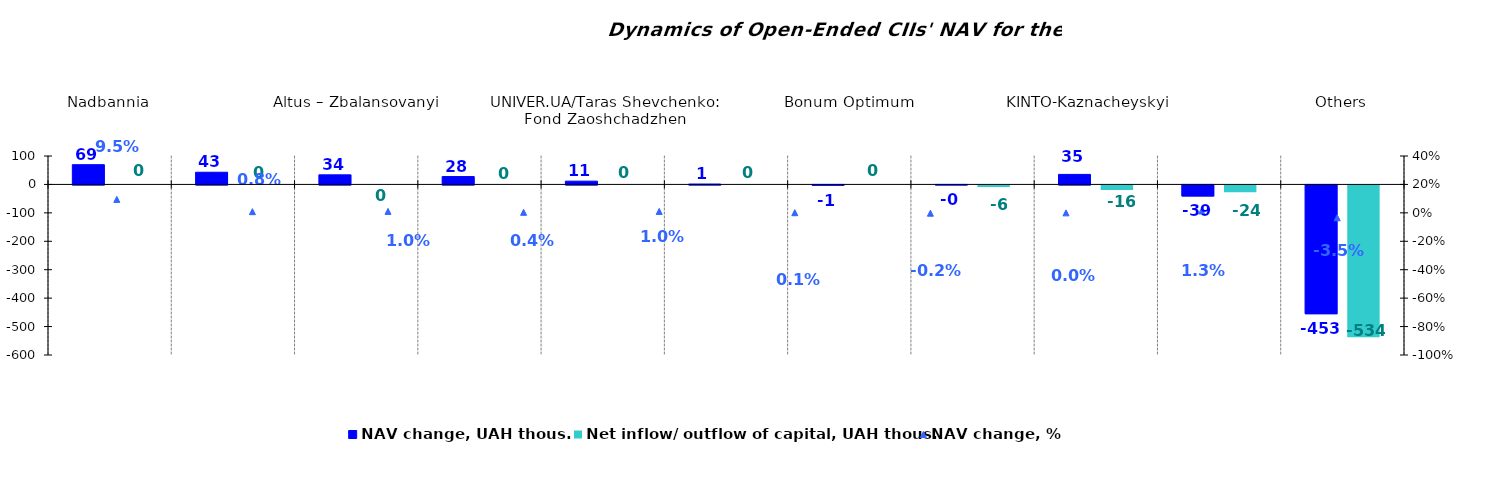
| Category | NAV change, UAH thous. | Net inflow/ outflow of capital, UAH thous. |
|---|---|---|
| Nadbannia | 69.468 | 0 |
| Sofiivskyi | 42.84 | 0 |
| Altus – Zbalansovanyi | 33.71 | 0 |
| UNIVER.UA/Myhailo Hrushevskyi: Fond Derzhavnykh Paperiv    | 27.664 | 0 |
| UNIVER.UA/Taras Shevchenko: Fond Zaoshchadzhen | 11.472 | 0 |
| ТАSK Resurs | 1.214 | 0 |
| Bonum Optimum | -1.098 | 0 |
| UNIVER.UA/Volodymyr Velykyi: Fond Zbalansovanyi | -0.198 | -5.799 |
| KINTO-Kaznacheyskyi    | 35.296 | -16.342 |
| UNIVER.UA/Iaroslav Mudryi: Fond Aktsii | -38.758 | -24.313 |
| Others | -452.904 | -534.426 |